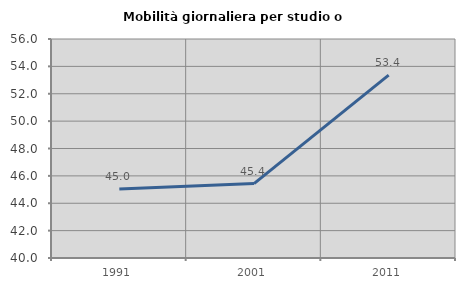
| Category | Mobilità giornaliera per studio o lavoro |
|---|---|
| 1991.0 | 45.045 |
| 2001.0 | 45.44 |
| 2011.0 | 53.36 |